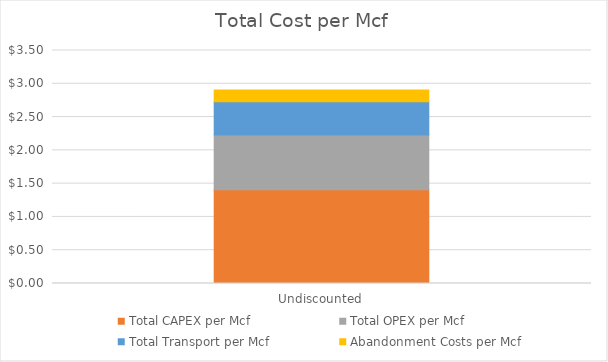
| Category | Total CAPEX per Mcf | Total OPEX per Mcf | Total Transport per Mcf | Abandonment Costs per Mcf |
|---|---|---|---|---|
| Undiscounted | 1.409 | 0.821 | 0.5 | 0.176 |